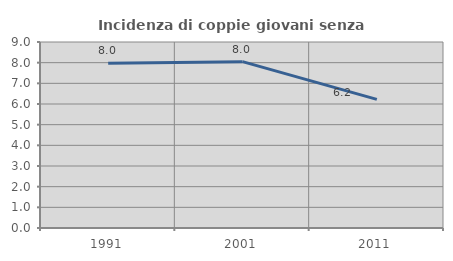
| Category | Incidenza di coppie giovani senza figli |
|---|---|
| 1991.0 | 7.974 |
| 2001.0 | 8.049 |
| 2011.0 | 6.226 |